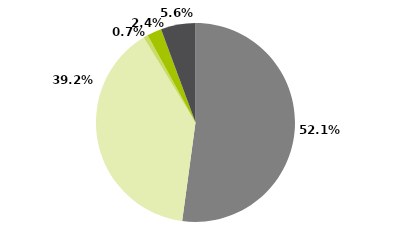
| Category | Series 0 |
|---|---|
| Multimercados Macro | 0.521 |
| Multimercados Livre | 0.392 |
| Multimercados L/S - Neutro | 0.007 |
| Multimercados L/S - Direcional | 0.024 |
| Outros | 0.056 |